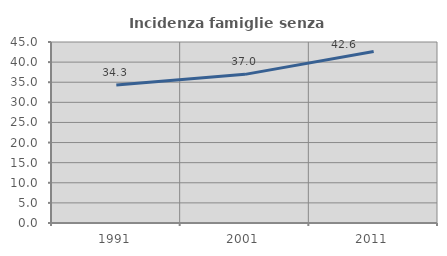
| Category | Incidenza famiglie senza nuclei |
|---|---|
| 1991.0 | 34.321 |
| 2001.0 | 36.957 |
| 2011.0 | 42.619 |